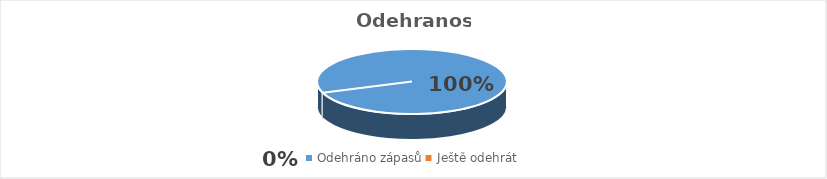
| Category | Series 0 |
|---|---|
| Odehráno zápasů | 36 |
| Ještě odehrát | 0 |